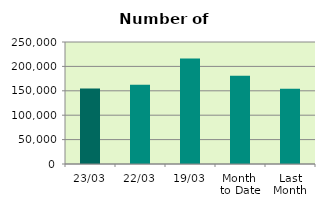
| Category | Series 0 |
|---|---|
| 23/03 | 154794 |
| 22/03 | 162516 |
| 19/03 | 216202 |
| Month 
to Date | 180647.412 |
| Last
Month | 154356.5 |